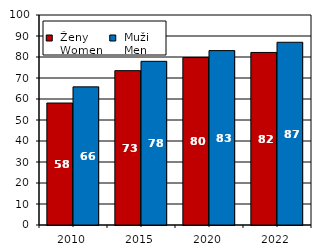
| Category |  Ženy 
 Women |  Muži 
 Men |
|---|---|---|
| 2010.0 | 58.083 | 65.781 |
| 2015.0 | 73.498 | 77.942 |
| 2020.0 | 79.718 | 83.05 |
| 2022.0 | 82.17 | 87.01 |